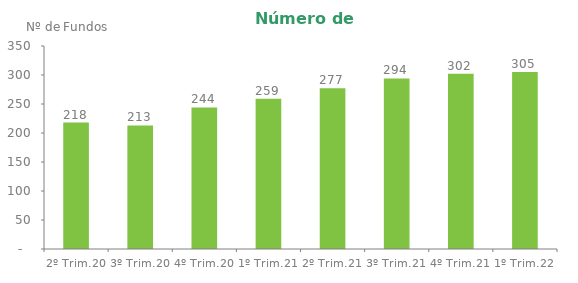
| Category | Series 0 |
|---|---|
| 2º Trim.20 | 218 |
| 3º Trim.20 | 213 |
| 4º Trim.20 | 244 |
| 1º Trim.21 | 259 |
| 2º Trim.21 | 277 |
| 3º Trim.21 | 294 |
| 4º Trim.21 | 302 |
| 1º Trim.22 | 305 |